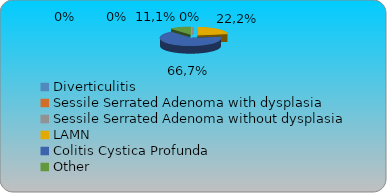
| Category | Series 0 | Series 1 | Series 2 | Series 3 |
|---|---|---|---|---|
| Diverticulitis | 0 |  |  |  |
| Sessile Serrated Adenoma with dysplasia | 0 |  |  |  |
| Sessile Serrated Adenoma without dysplasia | 0 |  |  |  |
| LAMN | 0.222 |  |  |  |
| Colitis Cystica Profunda | 0.667 |  |  |  |
| Other  | 0.111 |  |  |  |